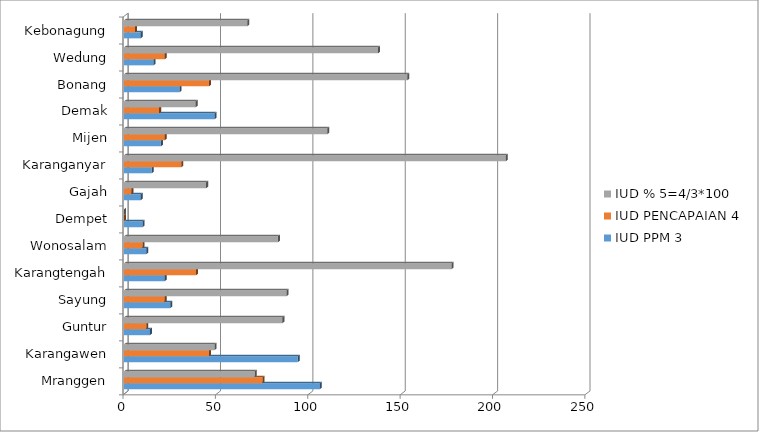
| Category | IUD |
|---|---|
| Mranggen | 70.755 |
| Karangawen | 48.936 |
| Guntur | 85.714 |
| Sayung | 88 |
| Karangtengah | 177.273 |
| Wonosalam | 83.333 |
| Dempet | 0 |
| Gajah | 44.444 |
| Karanganyar | 206.667 |
| Mijen | 110 |
| Demak | 38.776 |
| Bonang | 153.333 |
| Wedung | 137.5 |
| Kebonagung | 66.667 |